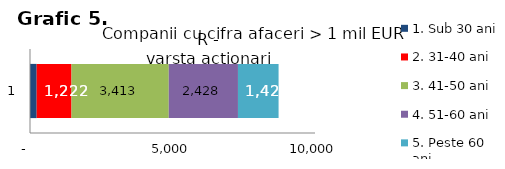
| Category | 1. Sub 30 ani | 2. 31-40 ani | 3. 41-50 ani | 4. 51-60 ani | 5. Peste 60 ani |
|---|---|---|---|---|---|
| 0 | 234 | 1222 | 3413 | 2428 | 1425 |